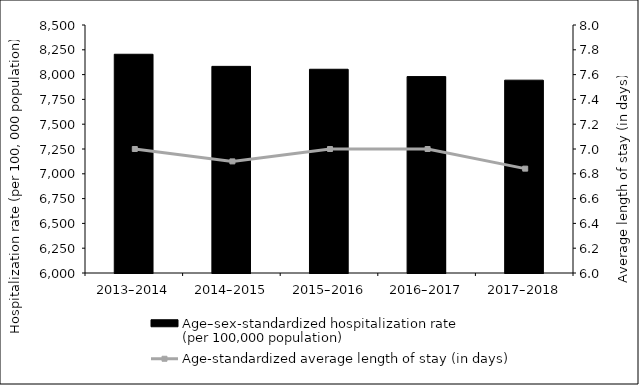
| Category | Age–sex-standardized hospitalization rate 
(per 100,000 population) |
|---|---|
| 2013–2014 | 8205 |
| 2014–2015 | 8083 |
| 2015–2016 | 8053.914 |
| 2016–2017 | 7980 |
| 2017–2018 | 7943.875 |